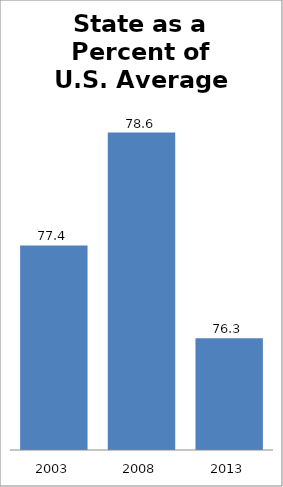
| Category | Series 0 |
|---|---|
| 2003.0 | 77.351 |
| 2008.0 | 78.649 |
| 2013.0 | 76.286 |